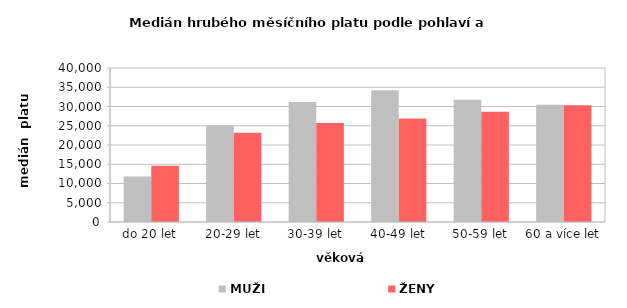
| Category | MUŽI | ŽENY |
|---|---|---|
| 0 | 11815.021 | 14632.12 |
| 1 | 24975.409 | 23195.324 |
| 2 | 31178.401 | 25730.046 |
| 3 | 34213.012 | 26909.132 |
| 4 | 31727.029 | 28624.336 |
| 5 | 30447.654 | 30298.501 |